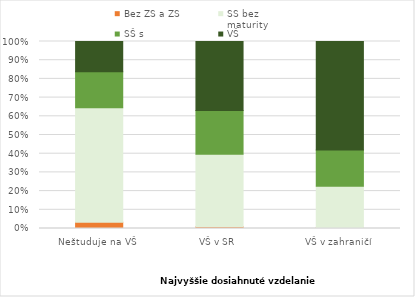
| Category | Bez ZŠ a ZŠ | SŠ bez
maturity | SŠ s
maturitou | VŠ |
|---|---|---|---|---|
| Neštuduje na VŠ | 0.034 | 0.612 | 0.192 | 0.162 |
| VŠ v SR | 0.01 | 0.388 | 0.234 | 0.369 |
| VŠ v zahraničí | 0.004 | 0.222 | 0.193 | 0.58 |